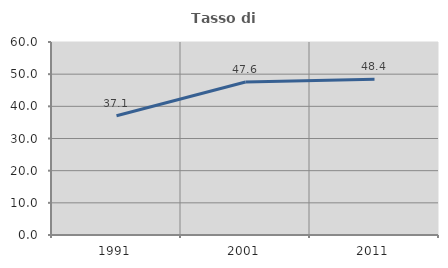
| Category | Tasso di occupazione   |
|---|---|
| 1991.0 | 37.061 |
| 2001.0 | 47.564 |
| 2011.0 | 48.396 |